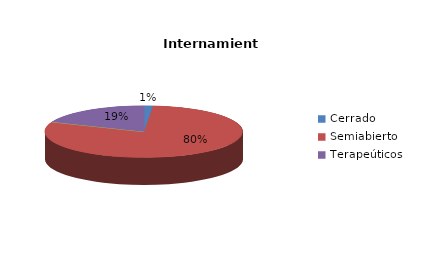
| Category | Series 0 |
|---|---|
| Cerrado | 1 |
| Semiabierto | 55 |
| Abierto | 0 |
| Terapeúticos | 13 |